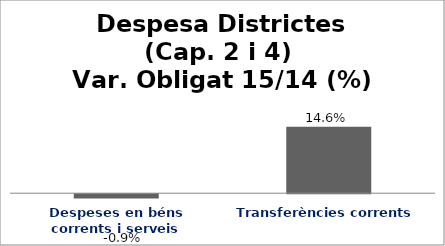
| Category | Series 0 |
|---|---|
| Despeses en béns corrents i serveis | -0.009 |
| Transferències corrents | 0.146 |